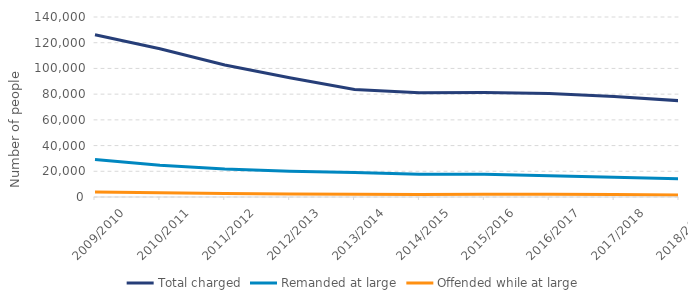
| Category | Total charged | Remanded at large | Offended while at large |
|---|---|---|---|
| 2009/2010 | 126189 | 29078 | 3875 |
| 2010/2011 | 115261 | 24683 | 3233 |
| 2011/2012 | 102708 | 21712 | 2633 |
| 2012/2013 | 92678 | 20065 | 2266 |
| 2013/2014 | 83618 | 19148 | 2115 |
| 2014/2015 | 81113 | 17665 | 2031 |
| 2015/2016 | 81360 | 17761 | 2159 |
| 2016/2017 | 80528 | 16601 | 2156 |
| 2017/2018 | 78102 | 15369 | 1953 |
| 2018/2019 | 74907 | 14271 | 1576 |